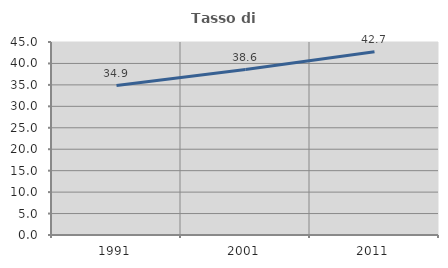
| Category | Tasso di occupazione   |
|---|---|
| 1991.0 | 34.857 |
| 2001.0 | 38.576 |
| 2011.0 | 42.71 |